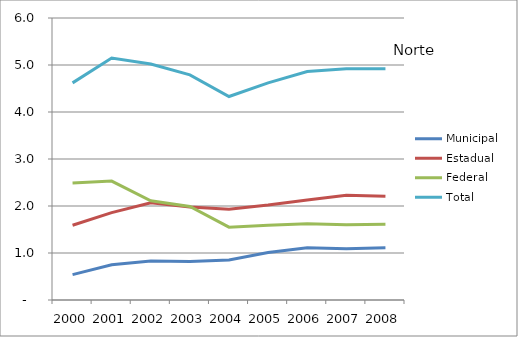
| Category | Municipal | Estadual | Federal | Total |
|---|---|---|---|---|
| 2000.0 | 0.54 | 1.59 | 2.49 | 4.62 |
| 2001.0 | 0.75 | 1.86 | 2.53 | 5.15 |
| 2002.0 | 0.83 | 2.07 | 2.11 | 5.02 |
| 2003.0 | 0.82 | 1.98 | 1.99 | 4.79 |
| 2004.0 | 0.85 | 1.93 | 1.55 | 4.33 |
| 2005.0 | 1.01 | 2.02 | 1.59 | 4.62 |
| 2006.0 | 1.11 | 2.13 | 1.62 | 4.86 |
| 2007.0 | 1.09 | 2.23 | 1.6 | 4.92 |
| 2008.0 | 1.11 | 2.21 | 1.61 | 4.92 |